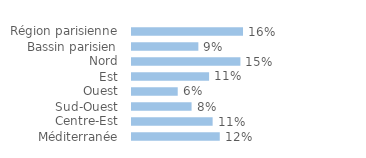
| Category | Series 0 |
|---|---|
| Région parisienne | 0.157 |
| Bassin parisien | 0.094 |
| Nord | 0.153 |
| Est | 0.109 |
| Ouest | 0.065 |
| Sud-Ouest | 0.084 |
| Centre-Est | 0.114 |
| Méditerranée | 0.124 |